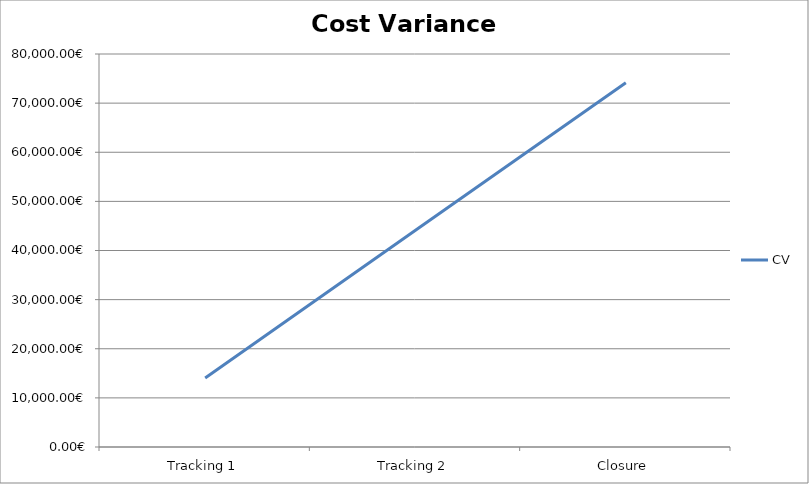
| Category | CV |
|---|---|
| Tracking 1 | 14050.8 |
| Tracking 2 | 44123.7 |
| Closure | 74160 |